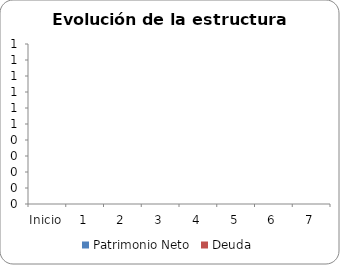
| Category | Patrimonio Neto | Deuda |
|---|---|---|
| Inicio | 0 | 0 |
| 1 | 0 | 0 |
| 2 | 0 | 0 |
| 3 | 0 | 0 |
| 4 | 0 | 0 |
| 5 | 0 | 0 |
| 6 | 0 | 0 |
| 7 | 0 | 0 |